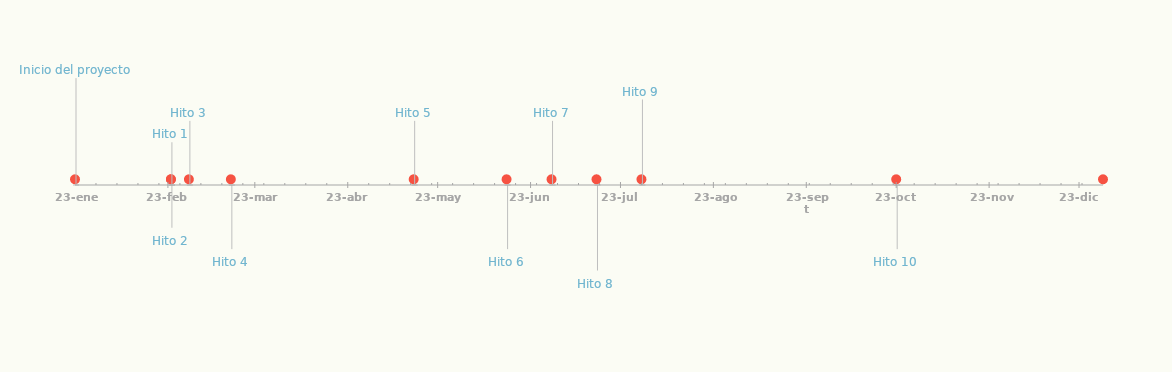
| Category | CARGO |
|---|---|
| Inicio del proyecto | 25 |
| Hito 1 | 10 |
| Hito 2 | -10 |
| Hito 3 | 15 |
| Hito 4 | -15 |
| Hito 5 | 15 |
| Hito 6 | -15 |
| Hito 7 | 15 |
| Hito 8 | -20 |
| Hito 9 | 20 |
| Hito 10 | -15 |
| Fin del proyecto | 15 |